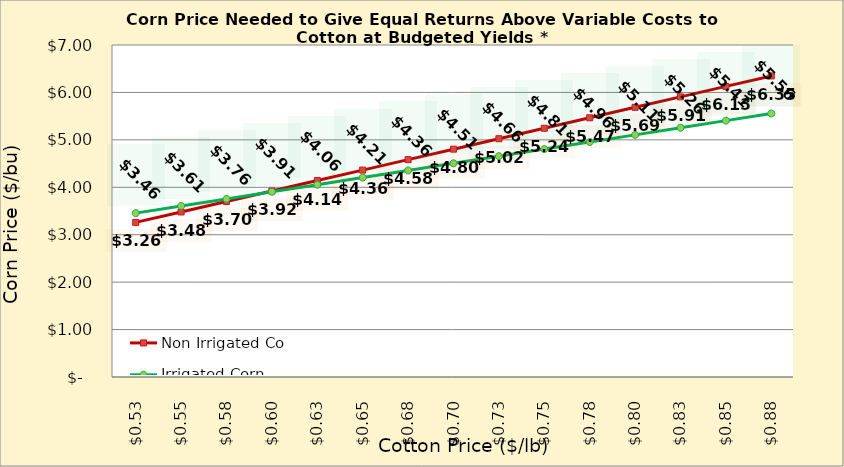
| Category | Non Irrigated Corn | Irrigated Corn |
|---|---|---|
| 0.5249999999999998 | 3.26 | 3.455 |
| 0.5499999999999998 | 3.48 | 3.605 |
| 0.5749999999999998 | 3.701 | 3.755 |
| 0.5999999999999999 | 3.921 | 3.905 |
| 0.6249999999999999 | 4.142 | 4.055 |
| 0.6499999999999999 | 4.362 | 4.205 |
| 0.6749999999999999 | 4.583 | 4.355 |
| 0.7 | 4.804 | 4.505 |
| 0.725 | 5.024 | 4.655 |
| 0.75 | 5.245 | 4.805 |
| 0.775 | 5.465 | 4.955 |
| 0.8 | 5.686 | 5.105 |
| 0.8250000000000001 | 5.907 | 5.255 |
| 0.8500000000000001 | 6.127 | 5.405 |
| 0.8750000000000001 | 6.348 | 5.555 |